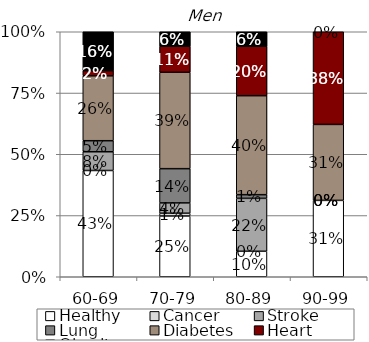
| Category | Healthy | Cancer | Stroke | Lung | Diabetes | Heart | Obesity |
|---|---|---|---|---|---|---|---|
| 60-69 | 0.434 | 0 | 0.076 | 0.045 | 0.265 | 0.021 | 0.159 |
| 70-79 | 0.248 | 0.011 | 0.042 | 0.14 | 0.394 | 0.106 | 0.059 |
| 80-89 | 0.104 | 0 | 0.216 | 0.015 | 0.404 | 0.202 | 0.059 |
| 90-99 | 0.312 | 0 | 0 | 0 | 0.31 | 0.378 | 0 |